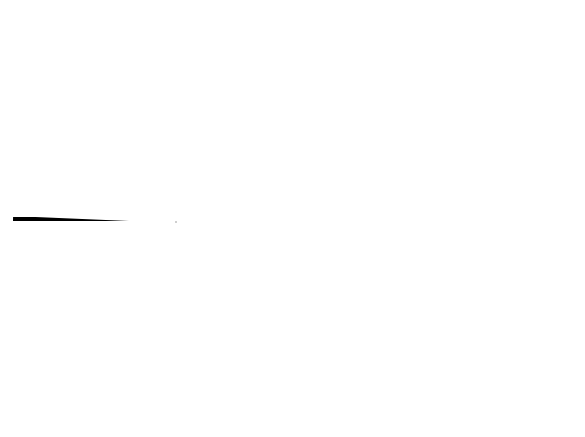
| Category | Series 0 |
|---|---|
| Value | 0 |
| Pointer | 1 |
| End | 149 |